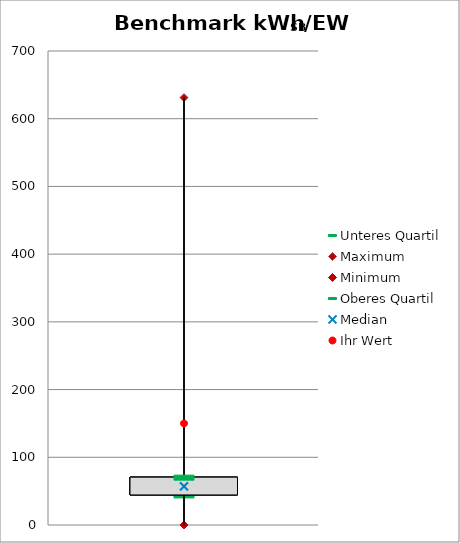
| Category | Unteres Quartil | Maximum | Minimum | Oberes Quartil |
|---|---|---|---|---|
| kWhSB/EW | 44.399 | 631.164 | 0.048 | 70.667 |